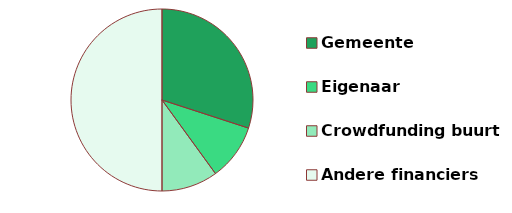
| Category | Series 0 |
|---|---|
| Gemeente | 0.3 |
| Eigenaar | 0.1 |
| Crowdfunding buurt | 0.1 |
| Andere financiers | 0.5 |